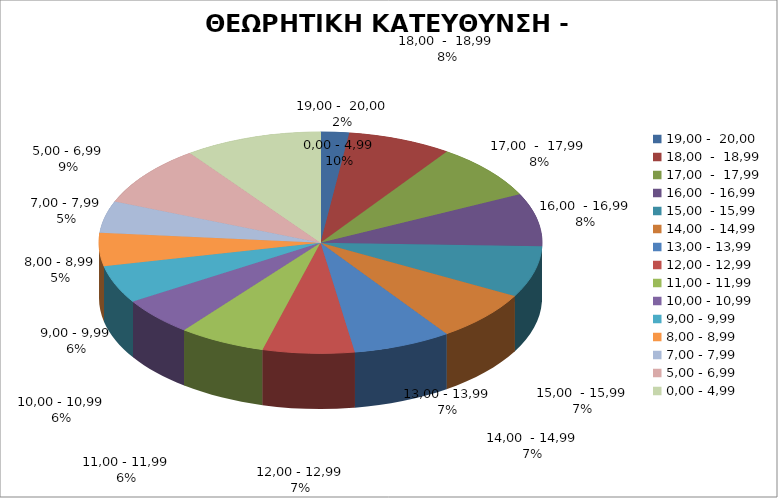
| Category | ΘΕΩΡΗΤΙΚΗ ΚΑΤΕΥΘΥΝΣΗ |
|---|---|
| 19,00 -  20,00 | 2.074 |
| 18,00  -  18,99 | 7.564 |
| 17,00  -  17,99 | 8.158 |
| 16,00  - 16,99 | 7.734 |
| 15,00  - 15,99 | 7.465 |
| 14,00  - 14,99 | 7.377 |
| 13,00 - 13,99 | 7.157 |
| 12,00 - 12,99 | 6.678 |
| 11,00 - 11,99 | 6.339 |
| 10,00 - 10,99 | 5.515 |
| 9,00 - 9,99 | 5.521 |
| 8,00 - 8,99 | 4.83 |
| 7,00 - 7,99 | 4.652 |
| 5,00 - 6,99 | 8.917 |
| 0,00 - 4,99 | 10.018 |